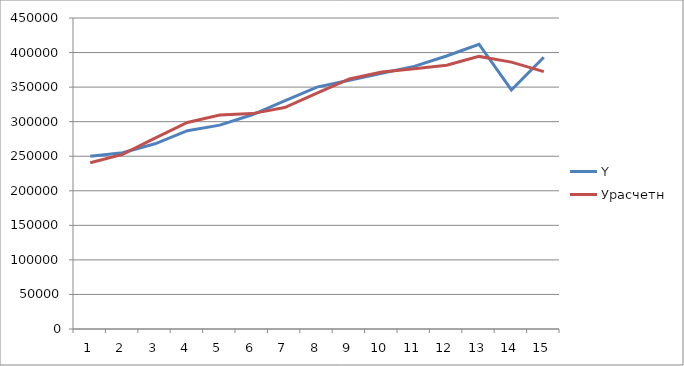
| Category | Y | Урасчетн |
|---|---|---|
| 0 | 250000 | 240474.987 |
| 1 | 255000 | 252643.966 |
| 2 | 268000 | 276055.684 |
| 3 | 287000 | 298760.907 |
| 4 | 295000 | 309560.021 |
| 5 | 310000 | 311655.79 |
| 6 | 330000 | 320400.083 |
| 7 | 350000 | 341434.779 |
| 8 | 360000 | 361823.697 |
| 9 | 370000 | 371827.035 |
| 10 | 380000 | 376735.716 |
| 11 | 395000 | 381677.529 |
| 12 | 412030 | 394439.158 |
| 13 | 345846 | 386137.902 |
| 14 | 393250 | 372403.932 |